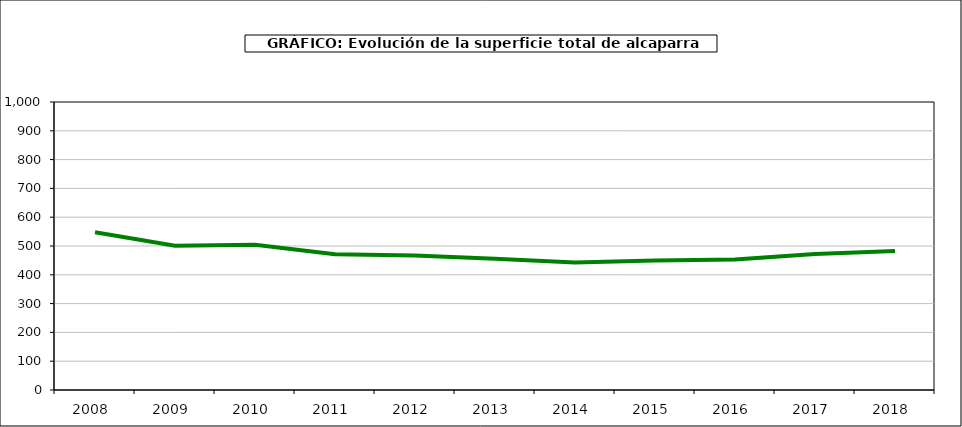
| Category | superficie |
|---|---|
| 2008.0 | 548 |
| 2009.0 | 501 |
| 2010.0 | 504 |
| 2011.0 | 471 |
| 2012.0 | 467 |
| 2013.0 | 456 |
| 2014.0 | 443 |
| 2015.0 | 450 |
| 2016.0 | 453 |
| 2017.0 | 472 |
| 2018.0 | 483 |